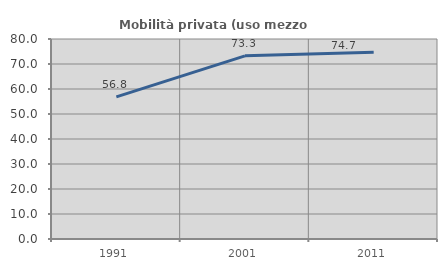
| Category | Mobilità privata (uso mezzo privato) |
|---|---|
| 1991.0 | 56.825 |
| 2001.0 | 73.252 |
| 2011.0 | 74.679 |